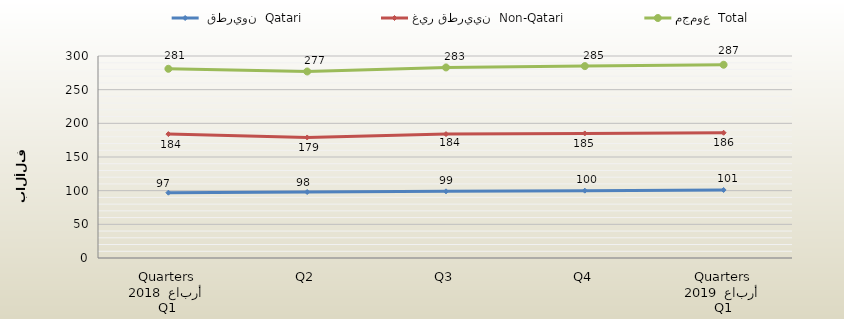
| Category |  قطريون  Qatari | غير قطريين  Non-Qatari | مجموع  Total |
|---|---|---|---|
| 0 | 97 | 184 | 281 |
| 1 | 98 | 179 | 277 |
| 2 | 99 | 184 | 283 |
| 3 | 100 | 185 | 285 |
| 4 | 101 | 186 | 287 |